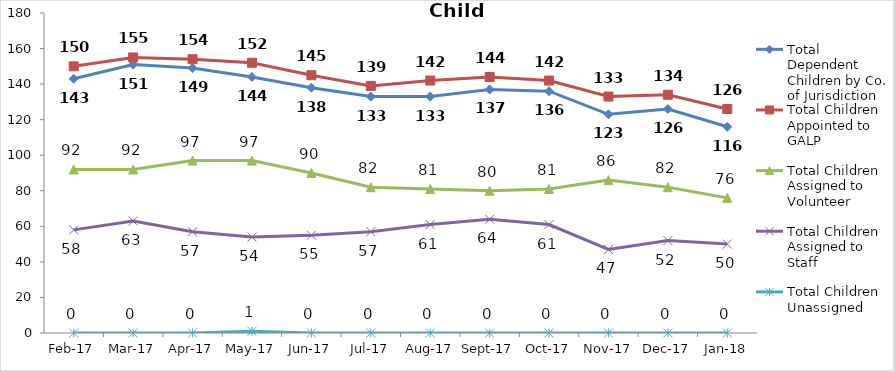
| Category | Total Dependent Children by Co. of Jurisdiction | Total Children Appointed to GALP | Total Children Assigned to Volunteer | Total Children Assigned to Staff | Total Children Unassigned |
|---|---|---|---|---|---|
| 2017-02-01 | 143 | 150 | 92 | 58 | 0 |
| 2017-03-01 | 151 | 155 | 92 | 63 | 0 |
| 2017-04-01 | 149 | 154 | 97 | 57 | 0 |
| 2017-05-01 | 144 | 152 | 97 | 54 | 1 |
| 2017-06-01 | 138 | 145 | 90 | 55 | 0 |
| 2017-07-01 | 133 | 139 | 82 | 57 | 0 |
| 2017-08-01 | 133 | 142 | 81 | 61 | 0 |
| 2017-09-01 | 137 | 144 | 80 | 64 | 0 |
| 2017-10-01 | 136 | 142 | 81 | 61 | 0 |
| 2017-11-01 | 123 | 133 | 86 | 47 | 0 |
| 2017-12-01 | 126 | 134 | 82 | 52 | 0 |
| 2018-01-01 | 116 | 126 | 76 | 50 | 0 |